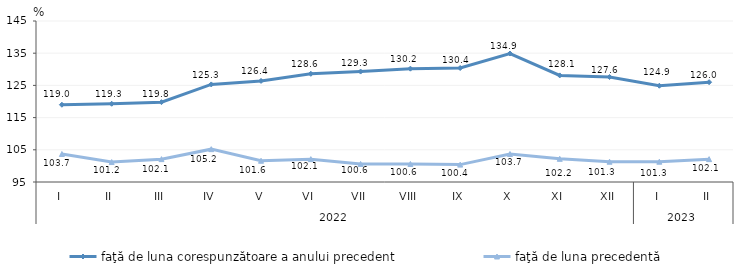
| Category | faţă de luna corespunzătoare a anului precedent | faţă de luna precedentă   |
|---|---|---|
| 0 | 119 | 103.7 |
| 1 | 119.3 | 101.2 |
| 2 | 119.8 | 102.1 |
| 3 | 125.3 | 105.2 |
| 4 | 126.4 | 101.6 |
| 5 | 128.6 | 102.1 |
| 6 | 129.3 | 100.6 |
| 7 | 130.2 | 100.6 |
| 8 | 130.4 | 100.4 |
| 9 | 134.9 | 103.7 |
| 10 | 128.1 | 102.2 |
| 11 | 127.6 | 101.3 |
| 12 | 124.9 | 101.3 |
| 13 | 126 | 102.1 |